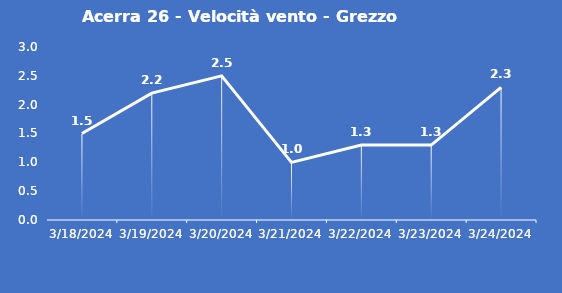
| Category | Acerra 26 - Velocità vento - Grezzo (m/s) |
|---|---|
| 3/18/24 | 1.5 |
| 3/19/24 | 2.2 |
| 3/20/24 | 2.5 |
| 3/21/24 | 1 |
| 3/22/24 | 1.3 |
| 3/23/24 | 1.3 |
| 3/24/24 | 2.3 |